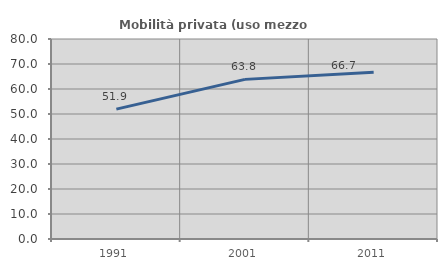
| Category | Mobilità privata (uso mezzo privato) |
|---|---|
| 1991.0 | 51.943 |
| 2001.0 | 63.85 |
| 2011.0 | 66.709 |